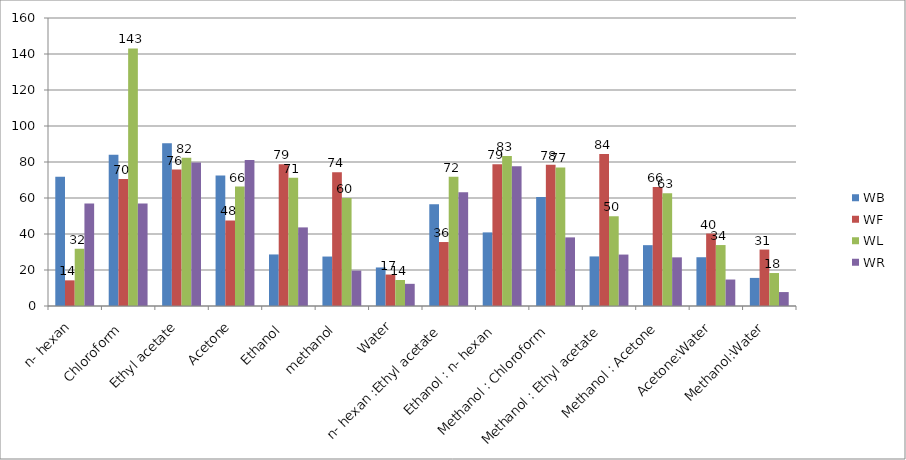
| Category | WB | WF | WL  | WR |
|---|---|---|---|---|
| n- hexan | 71.852 | 14.254 | 31.798 | 56.953 |
| Chloroform  | 84.043 | 70.498 | 143.06 | 56.953 |
| Ethyl acetate | 90.428 | 75.787 | 82.43 | 79.657 |
| Acetone | 72.497 | 47.536 | 66.37 | 81.076 |
| Ethanol  | 28.638 | 78.754 | 71.207 | 43.666 |
| methanol  | 27.477 | 74.303 | 60.049 | 19.672 |
| Water | 21.414 | 17.479 | 14.448 | 12.319 |
| n- hexan :Ethyl acetate  | 56.502 | 35.539 | 71.852 | 63.209 |
| Ethanol : n- hexan  | 40.893 | 78.689 | 83.269 | 77.593 |
| Methanol : Chloroform  | 60.565 | 78.431 | 76.948 | 38.119 |
| Methanol : Ethyl acetate  | 27.541 | 84.494 | 49.858 | 28.573 |
| Methanol : Acetone | 33.798 | 66.176 | 62.693 | 27.025 |
| Acetone:Water | 27.09 | 40.248 | 33.862 | 14.706 |
| Methanol:Water | 15.609 | 31.347 | 18.318 | 7.74 |